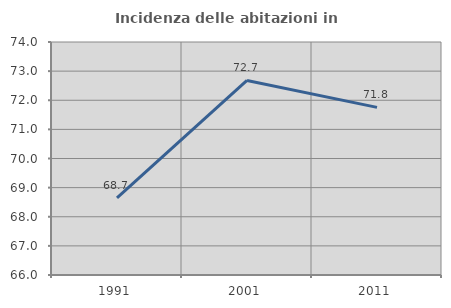
| Category | Incidenza delle abitazioni in proprietà  |
|---|---|
| 1991.0 | 68.65 |
| 2001.0 | 72.681 |
| 2011.0 | 71.755 |